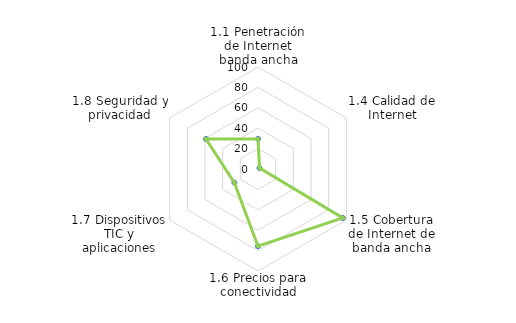
| Category | NACIONAL |
|---|---|
| 1.1 Penetración de Internet banda ancha | 29.46 |
| 1.4 Calidad de Internet | 1.76 |
| 1.5 Cobertura de Internet de banda ancha | 96 |
| 1.6 Precios para conectividad | 75.65 |
| 1.7 Dispositivos TIC y aplicaciones | 26.784 |
| 1.8 Seguridad y privacidad | 58.902 |